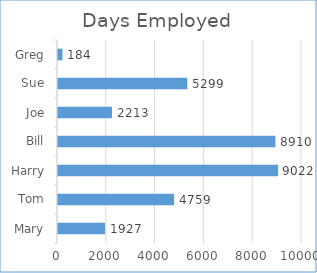
| Category | Days Employed |
|---|---|
| Mary | 1927 |
| Tom | 4759 |
| Harry | 9022 |
| Bill | 8910 |
| Joe | 2213 |
| Sue | 5299 |
| Greg | 184 |